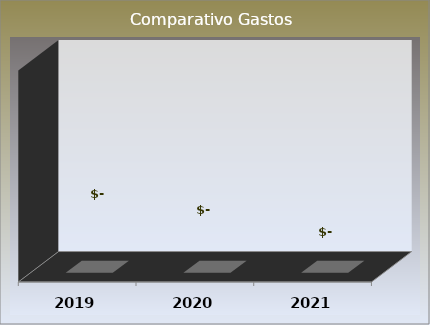
| Category | Series 0 |
|---|---|
| 2019.0 | 0 |
| 2020.0 | 0 |
| 2021.0 | 0 |